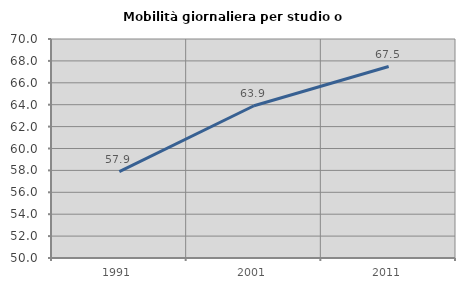
| Category | Mobilità giornaliera per studio o lavoro |
|---|---|
| 1991.0 | 57.885 |
| 2001.0 | 63.905 |
| 2011.0 | 67.483 |